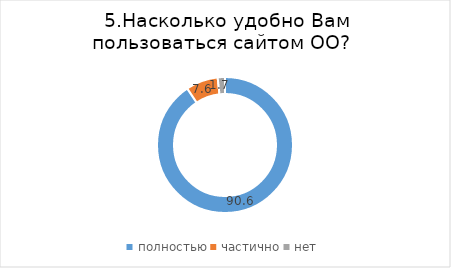
| Category | Series 0 |
|---|---|
| полностью | 90.629 |
| частично | 7.645 |
| нет | 1.726 |